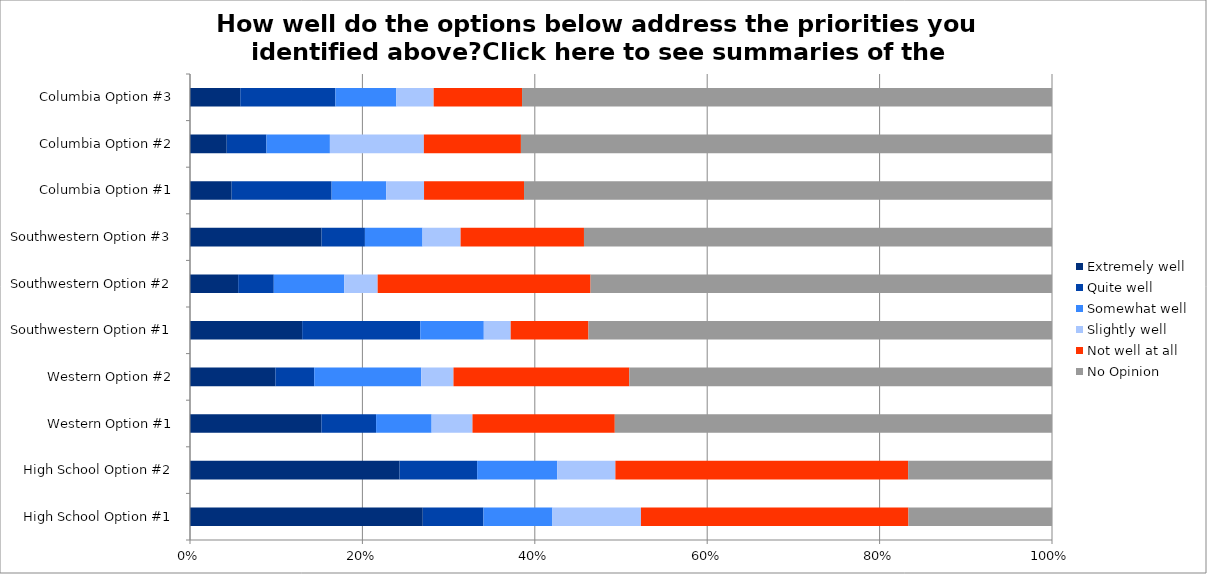
| Category | Extremely well | Quite well | Somewhat well | Slightly well | Not well at all | No Opinion |
|---|---|---|---|---|---|---|
| High School Option #1 | 0.27 | 0.07 | 0.08 | 0.103 | 0.31 | 0.166 |
| High School Option #2 | 0.243 | 0.09 | 0.093 | 0.068 | 0.34 | 0.167 |
| Western Option #1 | 0.152 | 0.064 | 0.064 | 0.047 | 0.165 | 0.507 |
| Western Option #2 | 0.099 | 0.045 | 0.124 | 0.038 | 0.204 | 0.49 |
| Southwestern Option #1 | 0.13 | 0.137 | 0.074 | 0.031 | 0.09 | 0.538 |
| Southwestern Option #2 | 0.056 | 0.041 | 0.082 | 0.039 | 0.247 | 0.535 |
| Southwestern Option #3 | 0.153 | 0.05 | 0.067 | 0.044 | 0.143 | 0.543 |
| Columbia Option #1 | 0.048 | 0.116 | 0.063 | 0.044 | 0.116 | 0.612 |
| Columbia Option #2 | 0.043 | 0.046 | 0.074 | 0.109 | 0.113 | 0.616 |
| Columbia Option #3 | 0.058 | 0.11 | 0.071 | 0.043 | 0.102 | 0.615 |